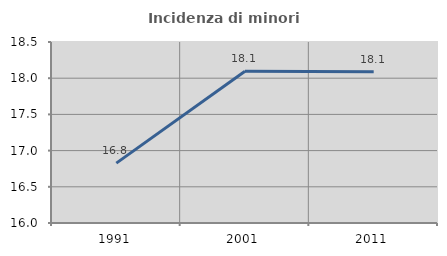
| Category | Incidenza di minori stranieri |
|---|---|
| 1991.0 | 16.827 |
| 2001.0 | 18.097 |
| 2011.0 | 18.089 |